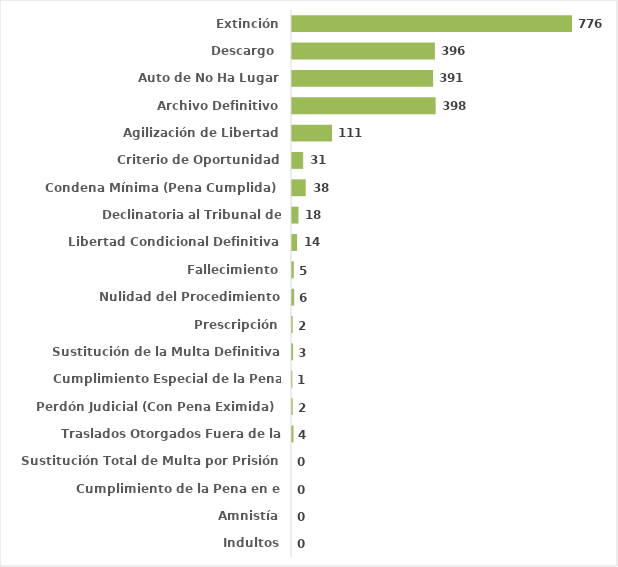
| Category | Series 0 |
|---|---|
| Indultos | 0 |
| Amnistía | 0 |
| Cumplimiento de la Pena en el Extranjero | 0 |
| Sustitución Total de Multa por Prisión | 0 |
| Traslados Otorgados Fuera de la Jurisdicción | 0.002 |
| Perdón Judicial (Con Pena Eximida)  | 0.001 |
| Cumplimiento Especial de la Pena Definitivo | 0 |
| Sustitución de la Multa Definitiva | 0.001 |
| Prescripción | 0.001 |
| Nulidad del Procedimiento | 0.003 |
| Fallecimiento | 0.002 |
| Libertad Condicional Definitiva | 0.006 |
| Declinatoria al Tribunal de Adolescentes | 0.008 |
| Condena Mínima (Pena Cumplida)  | 0.017 |
| Criterio de Oportunidad | 0.014 |
| Agilización de Libertad | 0.051 |
| Archivo Definitivo | 0.181 |
| Auto de No Ha Lugar | 0.178 |
| Descargo  | 0.18 |
| Extinción | 0.353 |